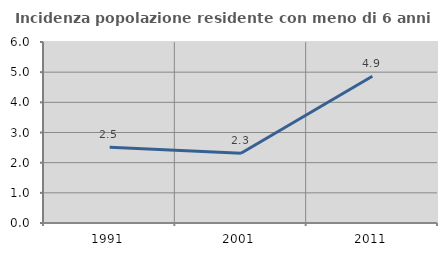
| Category | Incidenza popolazione residente con meno di 6 anni |
|---|---|
| 1991.0 | 2.51 |
| 2001.0 | 2.31 |
| 2011.0 | 4.867 |